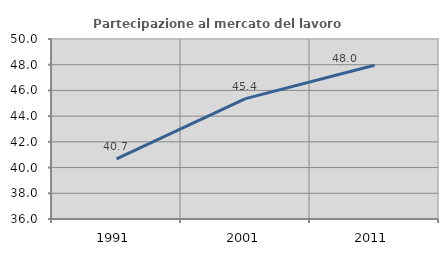
| Category | Partecipazione al mercato del lavoro  femminile |
|---|---|
| 1991.0 | 40.673 |
| 2001.0 | 45.364 |
| 2011.0 | 47.956 |